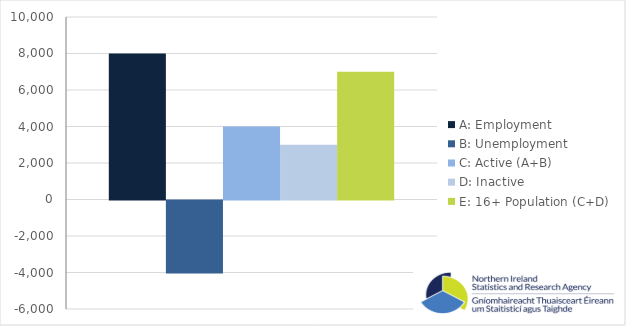
| Category | A: Employment | B: Unemployment | C: Active (A+B) | D: Inactive | E: 16+ Population (C+D) |
|---|---|---|---|---|---|
| 0 | 8000 | -4000 | 4000 | 3000 | 7000 |